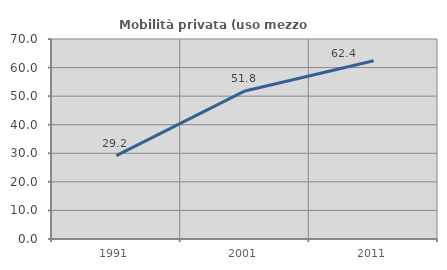
| Category | Mobilità privata (uso mezzo privato) |
|---|---|
| 1991.0 | 29.211 |
| 2001.0 | 51.818 |
| 2011.0 | 62.389 |